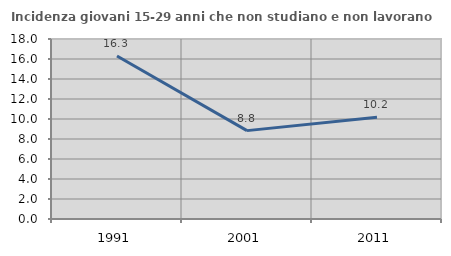
| Category | Incidenza giovani 15-29 anni che non studiano e non lavorano  |
|---|---|
| 1991.0 | 16.307 |
| 2001.0 | 8.837 |
| 2011.0 | 10.169 |